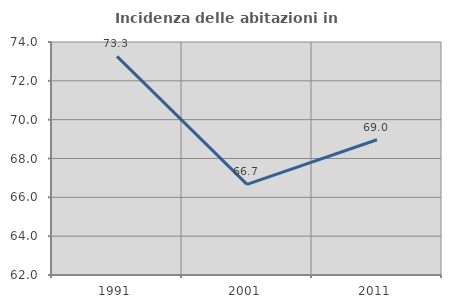
| Category | Incidenza delle abitazioni in proprietà  |
|---|---|
| 1991.0 | 73.262 |
| 2001.0 | 66.667 |
| 2011.0 | 68.966 |